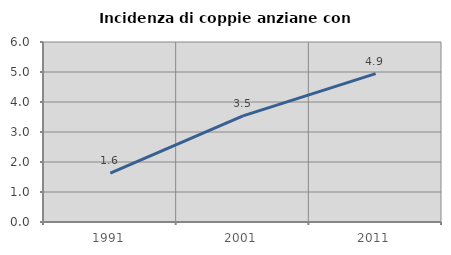
| Category | Incidenza di coppie anziane con figli |
|---|---|
| 1991.0 | 1.63 |
| 2001.0 | 3.54 |
| 2011.0 | 4.944 |